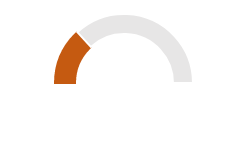
| Category | Series 0 |
|---|---|
| 0 | 0.132 |
| 1 | 0.368 |
| 2 | 0.5 |